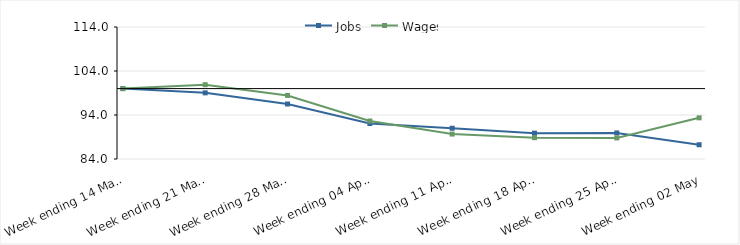
| Category | Jobs | Wages |
|---|---|---|
| 2020-03-14 | 100 | 100 |
| 2020-03-21 | 99.034 | 100.887 |
| 2020-03-28 | 96.499 | 98.449 |
| 2020-04-04 | 92.067 | 92.635 |
| 2020-04-11 | 90.989 | 89.664 |
| 2020-04-18 | 89.877 | 88.841 |
| 2020-04-25 | 89.919 | 88.788 |
| 2020-05-02 | 87.239 | 93.361 |